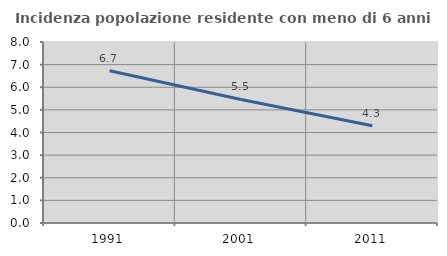
| Category | Incidenza popolazione residente con meno di 6 anni |
|---|---|
| 1991.0 | 6.732 |
| 2001.0 | 5.462 |
| 2011.0 | 4.302 |